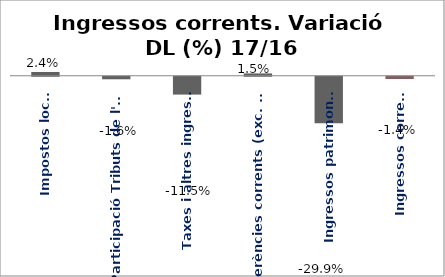
| Category | Series 0 |
|---|---|
| Impostos locals | 0.024 |
| Participació Tributs de l'Estat | -0.016 |
| Taxes i altres ingressos | -0.115 |
| Transferències corrents (exc. FCF) | 0.015 |
| Ingressos patrimonials | -0.299 |
| Ingressos corrents | -0.014 |